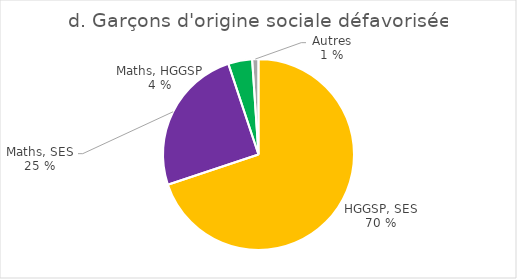
| Category | Garçons d'origine sociale défavorisée |
|---|---|
| HGGSP, SES | 1573 |
| Mathématiques, SES | 563 |
| Mathématiques, HGGSP | 91 |
| Autres | 24 |